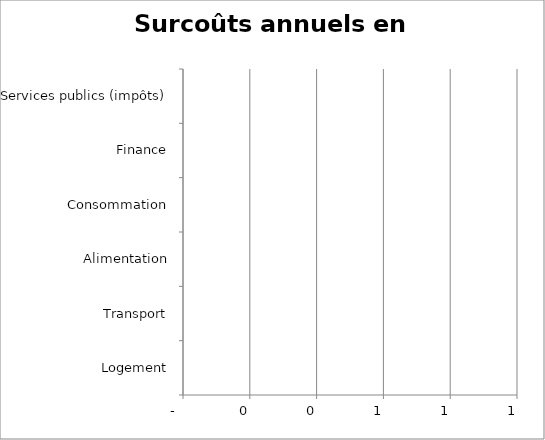
| Category | Series 0 |
|---|---|
| Logement | 0 |
| Transport | 0 |
| Alimentation | 0 |
| Consommation | 0 |
| Finance | 0 |
| Services publics (impôts) | 0 |